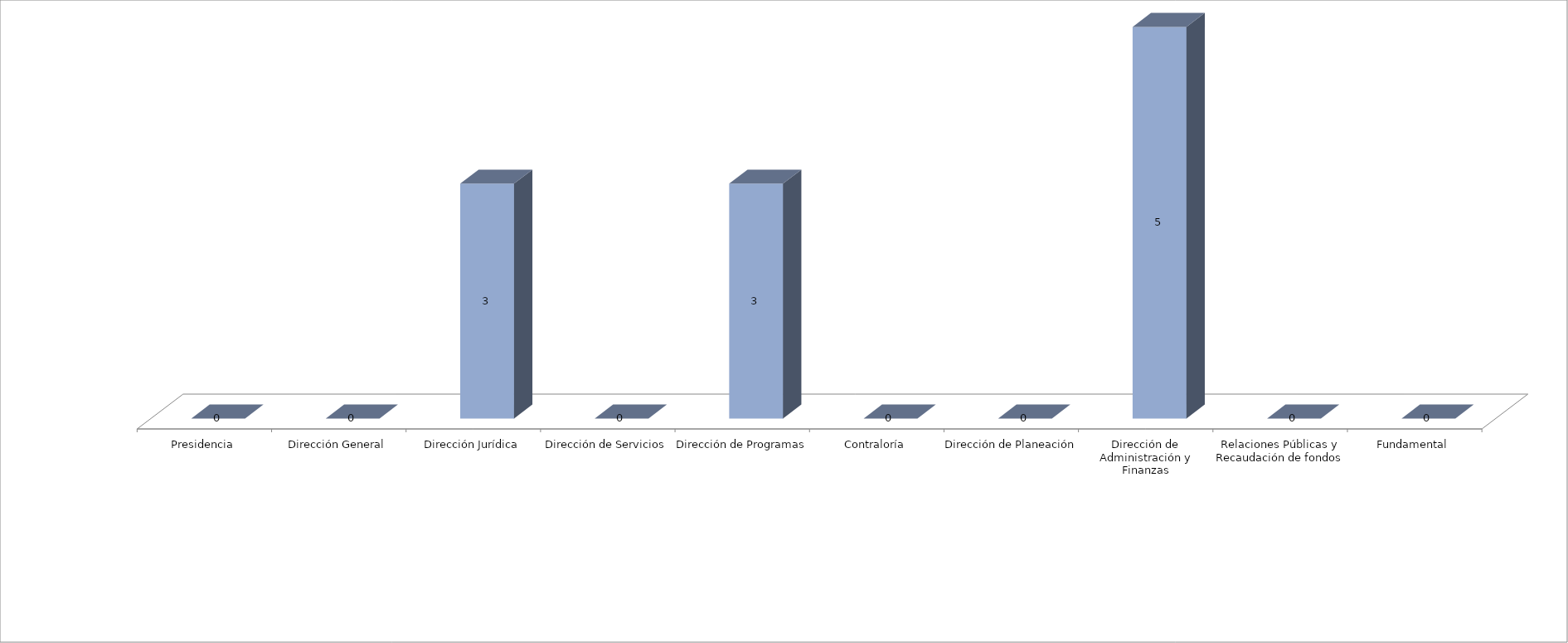
| Category | Series 0 | Series 1 |
|---|---|---|
| Presidencia |  | 0 |
| Dirección General |  | 0 |
| Dirección Jurídica |  | 3 |
| Dirección de Servicios |  | 0 |
| Dirección de Programas |  | 3 |
| Contraloría |  | 0 |
| Dirección de Planeación |  | 0 |
| Dirección de Administración y Finanzas |  | 5 |
| Relaciones Públicas y Recaudación de fondos |  | 0 |
| Fundamental |  | 0 |